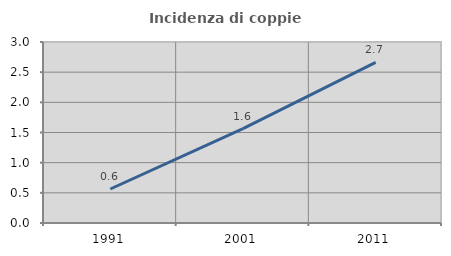
| Category | Incidenza di coppie miste |
|---|---|
| 1991.0 | 0.563 |
| 2001.0 | 1.565 |
| 2011.0 | 2.662 |